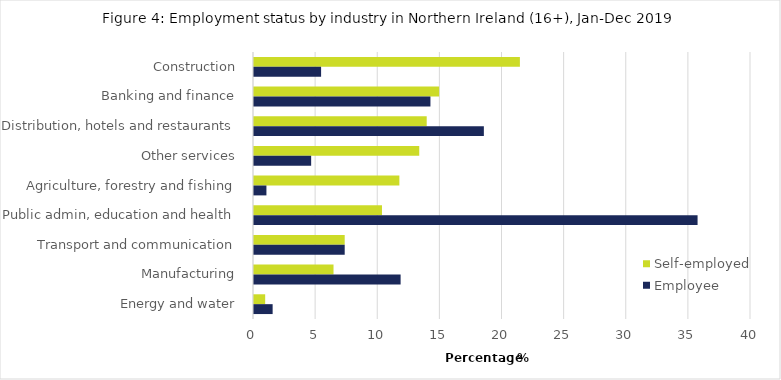
| Category | Self-employed | Employee |
|---|---|---|
| Construction | 21.4 | 5.4 |
| Banking and finance | 14.9 | 14.2 |
| Distribution, hotels and restaurants | 13.9 | 18.5 |
| Other services | 13.3 | 4.6 |
| Agriculture, forestry and fishing | 11.7 | 1 |
| Public admin, education and health | 10.3 | 35.7 |
| Transport and communication | 7.3 | 7.3 |
| Manufacturing | 6.4 | 11.8 |
| Energy and water | 0.9 | 1.5 |